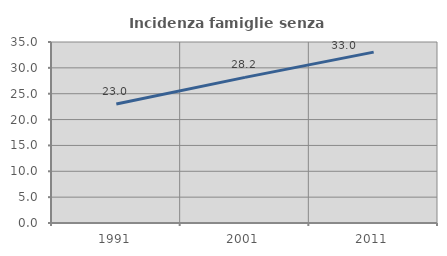
| Category | Incidenza famiglie senza nuclei |
|---|---|
| 1991.0 | 23.028 |
| 2001.0 | 28.155 |
| 2011.0 | 33.04 |